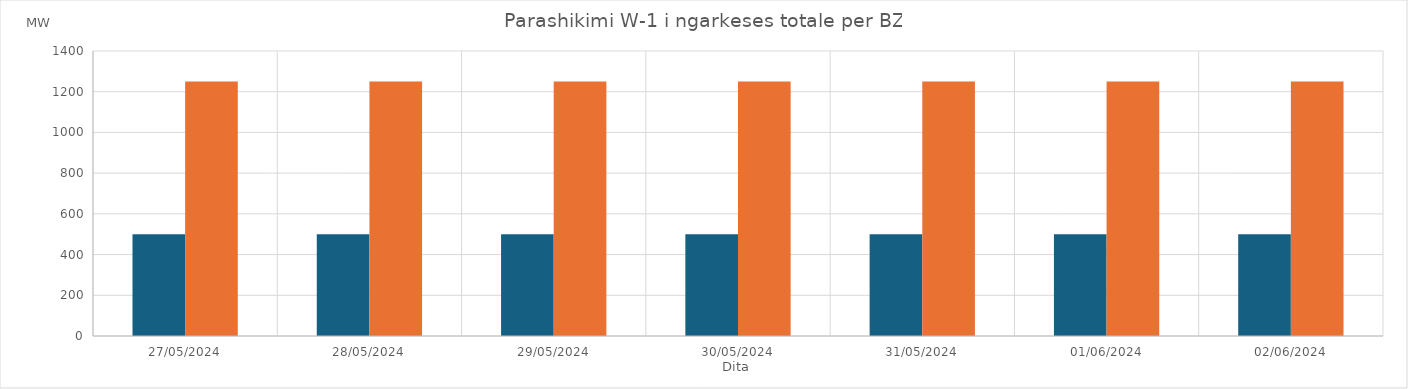
| Category | Min (MW) | Max (MW) |
|---|---|---|
| 27/05/2024 | 500 | 1250 |
| 28/05/2024 | 500 | 1250 |
| 29/05/2024 | 500 | 1250 |
| 30/05/2024 | 500 | 1250 |
| 31/05/2024 | 500 | 1250 |
| 01/06/2024 | 500 | 1250 |
| 02/06/2024 | 500 | 1250 |